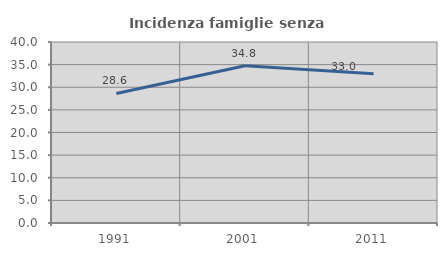
| Category | Incidenza famiglie senza nuclei |
|---|---|
| 1991.0 | 28.635 |
| 2001.0 | 34.766 |
| 2011.0 | 32.957 |